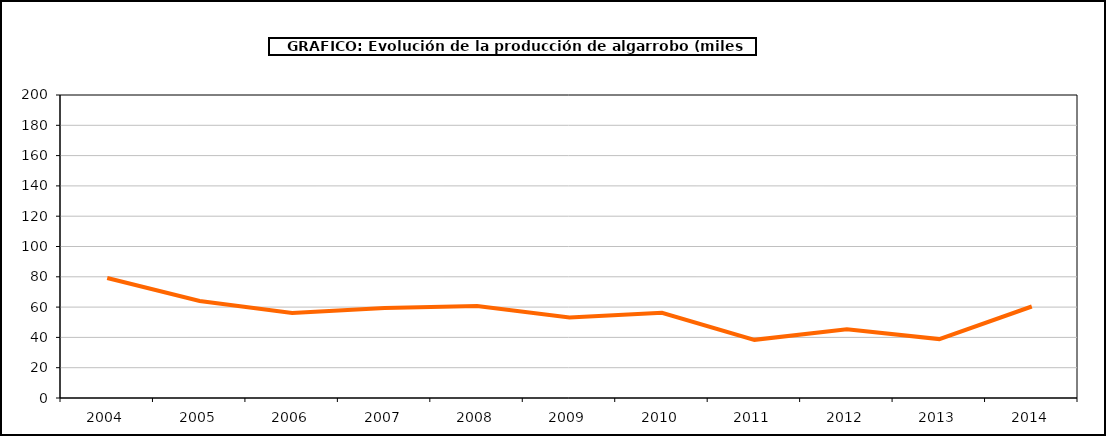
| Category | producción |
|---|---|
| 2004.0 | 79.227 |
| 2005.0 | 64.067 |
| 2006.0 | 56.081 |
| 2007.0 | 59.449 |
| 2008.0 | 60.795 |
| 2009.0 | 53.202 |
| 2010.0 | 56.286 |
| 2011.0 | 38.38 |
| 2012.0 | 45.414 |
| 2013.0 | 38.882 |
| 2014.0 | 60.4 |